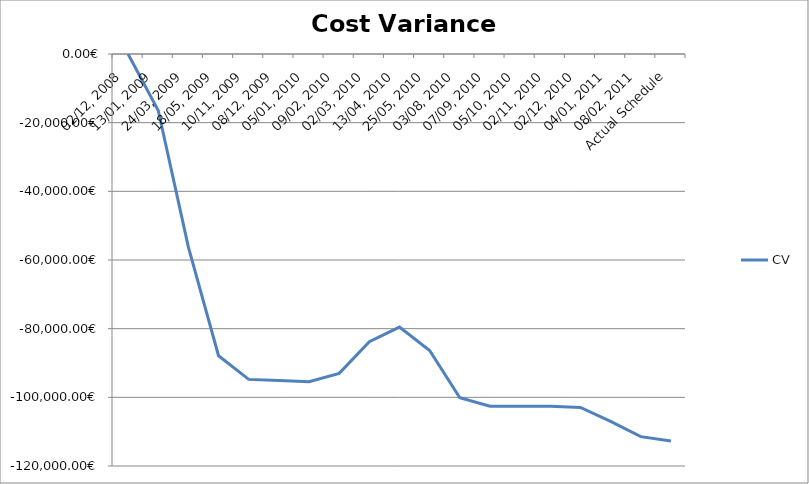
| Category | CV |
|---|---|
| 02/12, 2008 | 0 |
| 13/01, 2009 | -16467.002 |
| 24/03, 2009 | -56261.201 |
| 18/05, 2009 | -87895.228 |
| 10/11, 2009 | -94774.801 |
| 08/12, 2009 | -95110.268 |
| 05/01, 2010 | -95445.735 |
| 09/02, 2010 | -93021.64 |
| 02/03, 2010 | -83796.286 |
| 13/04, 2010 | -79542.157 |
| 25/05, 2010 | -86367.988 |
| 03/08, 2010 | -100132.441 |
| 07/09, 2010 | -102570.48 |
| 05/10, 2010 | -102570.483 |
| 02/11, 2010 | -102570.481 |
| 02/12, 2010 | -102925.385 |
| 04/01, 2011 | -107006.77 |
| 08/02, 2011 | -111443.059 |
| Actual Schedule | -112738.642 |